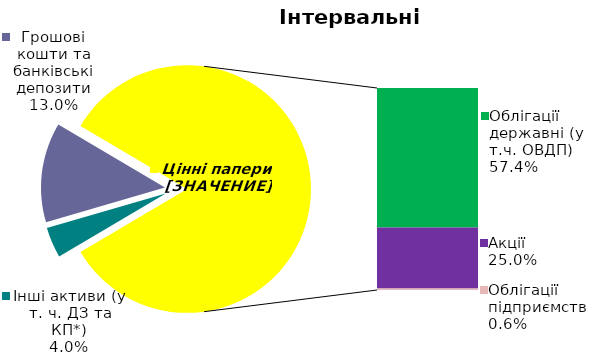
| Category | Series 0 |
|---|---|
| Інші активи (у т. ч. ДЗ та КП*) | 0.04 |
| Грошові кошти та банківські депозити | 0.13 |
| Банківські метали | 0 |
| Облігації державні (у т.ч. ОВДП) | 0.574 |
| Облігації місцевих позик | 0 |
| Акції | 0.25 |
| Облігації підприємств | 0.006 |